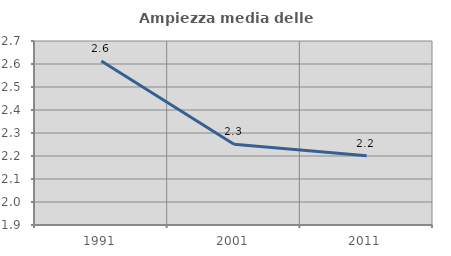
| Category | Ampiezza media delle famiglie |
|---|---|
| 1991.0 | 2.613 |
| 2001.0 | 2.251 |
| 2011.0 | 2.201 |